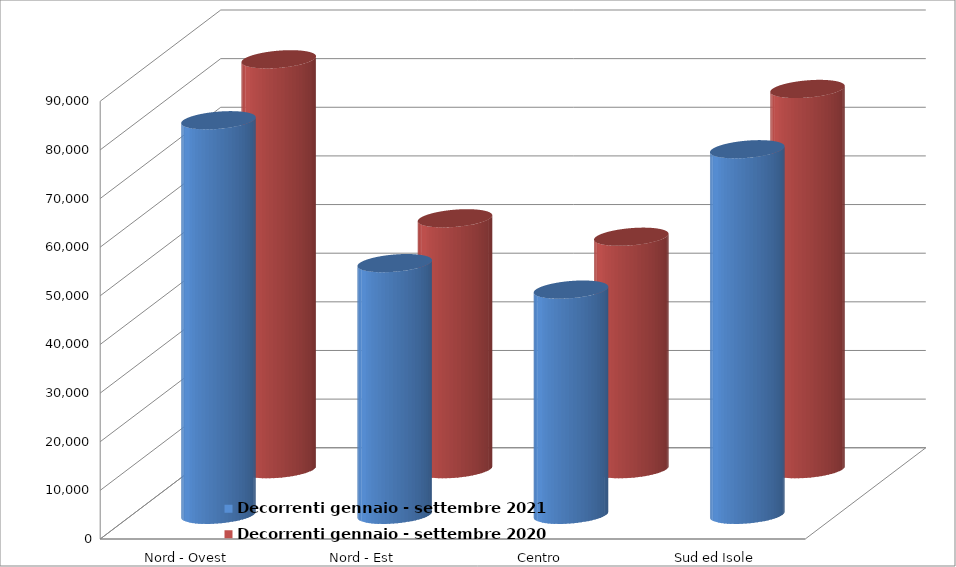
| Category | Decorrenti gennaio - settembre 2021 | Decorrenti gennaio - settembre 2020 |
|---|---|---|
| Nord - Ovest | 81121 | 84275 |
| Nord - Est | 51745 | 51582 |
| Centro | 46302 | 47790 |
| Sud ed Isole | 75158 | 78172 |